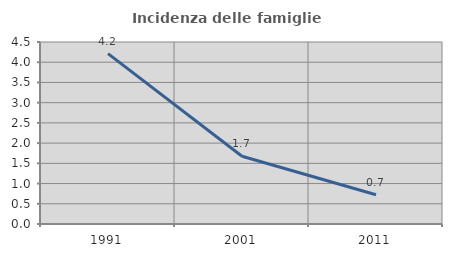
| Category | Incidenza delle famiglie numerose |
|---|---|
| 1991.0 | 4.213 |
| 2001.0 | 1.675 |
| 2011.0 | 0.723 |